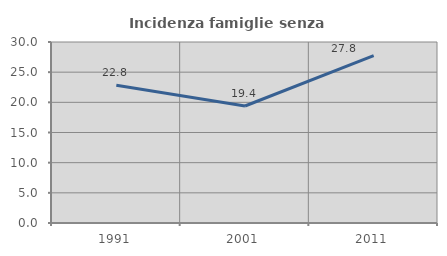
| Category | Incidenza famiglie senza nuclei |
|---|---|
| 1991.0 | 22.848 |
| 2001.0 | 19.389 |
| 2011.0 | 27.754 |